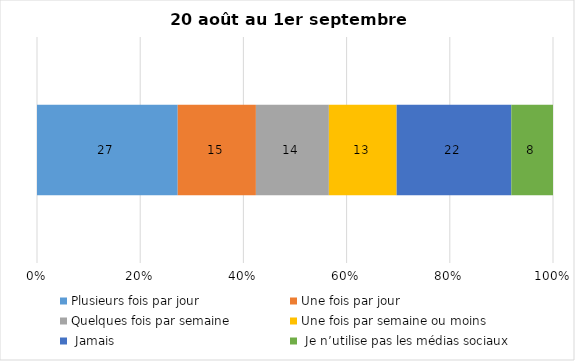
| Category | Plusieurs fois par jour | Une fois par jour | Quelques fois par semaine   | Une fois par semaine ou moins   |  Jamais   |  Je n’utilise pas les médias sociaux |
|---|---|---|---|---|---|---|
| 0 | 27 | 15 | 14 | 13 | 22 | 8 |